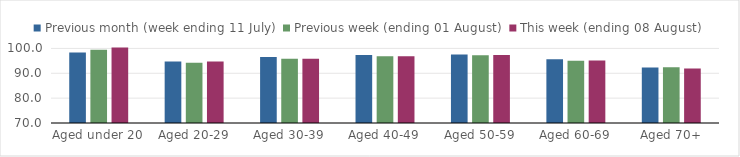
| Category | Previous month (week ending 11 July) | Previous week (ending 01 August) | This week (ending 08 August) |
|---|---|---|---|
| Aged under 20 | 98.396 | 99.429 | 100.403 |
| Aged 20-29 | 94.788 | 94.284 | 94.726 |
| Aged 30-39 | 96.584 | 95.846 | 95.8 |
| Aged 40-49 | 97.39 | 96.856 | 96.89 |
| Aged 50-59 | 97.571 | 97.283 | 97.396 |
| Aged 60-69 | 95.612 | 95.024 | 95.151 |
| Aged 70+ | 92.349 | 92.403 | 91.91 |